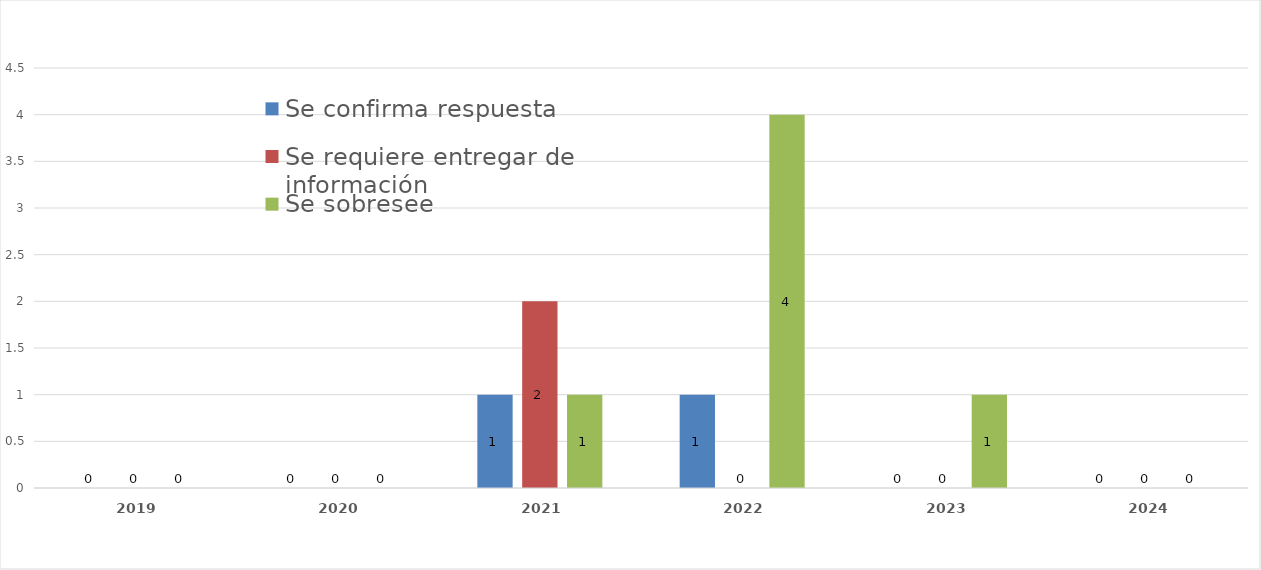
| Category | Se confirma respuesta | Se requiere entregar de información  | Se sobresee  |
|---|---|---|---|
| 2019.0 | 0 | 0 | 0 |
| 2020.0 | 0 | 0 | 0 |
| 2021.0 | 1 | 2 | 1 |
| 2022.0 | 1 | 0 | 4 |
| 2023.0 | 0 | 0 | 1 |
| 2024.0 | 0 | 0 | 0 |